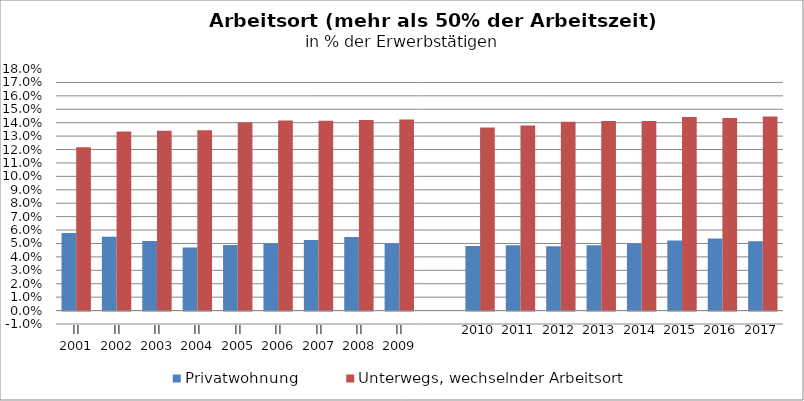
| Category | Privatwohnung | Unterwegs, wechselnder Arbeitsort |
|---|---|---|
| II
2001 | 0.058 | 0.122 |
| II
2002 | 0.055 | 0.133 |
| II
2003 | 0.052 | 0.134 |
| II
2004 | 0.047 | 0.134 |
| II
2005 | 0.049 | 0.14 |
| II
2006 | 0.05 | 0.142 |
| II
2007 | 0.053 | 0.141 |
| II
2008 | 0.055 | 0.142 |
| II
2009 | 0.05 | 0.142 |
|  | 0 | 0 |
| 2010 | 0.048 | 0.137 |
| 2011 | 0.049 | 0.138 |
| 2012 | 0.048 | 0.141 |
| 2013 | 0.049 | 0.141 |
| 2014 | 0.05 | 0.141 |
| 2015 | 0.052 | 0.144 |
| 2016 | 0.054 | 0.144 |
| 2017 | 0.052 | 0.145 |